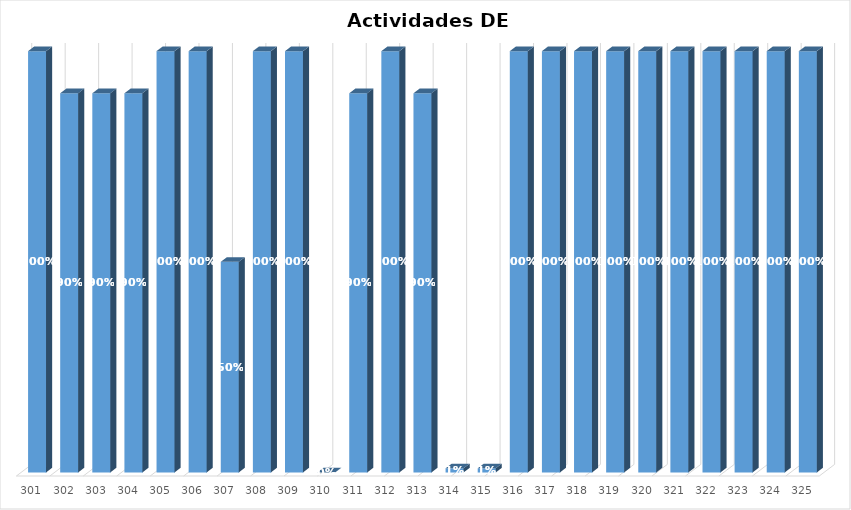
| Category | % Avance |
|---|---|
| 301.0 | 1 |
| 302.0 | 0.9 |
| 303.0 | 0.9 |
| 304.0 | 0.9 |
| 305.0 | 1 |
| 306.0 | 1 |
| 307.0 | 0.5 |
| 308.0 | 1 |
| 309.0 | 1 |
| 310.0 | 0 |
| 311.0 | 0.9 |
| 312.0 | 1 |
| 313.0 | 0.9 |
| 314.0 | 0.01 |
| 315.0 | 0.01 |
| 316.0 | 1 |
| 317.0 | 1 |
| 318.0 | 1 |
| 319.0 | 1 |
| 320.0 | 1 |
| 321.0 | 1 |
| 322.0 | 1 |
| 323.0 | 1 |
| 324.0 | 1 |
| 325.0 | 1 |